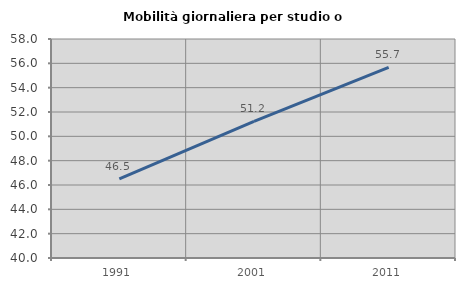
| Category | Mobilità giornaliera per studio o lavoro |
|---|---|
| 1991.0 | 46.502 |
| 2001.0 | 51.226 |
| 2011.0 | 55.659 |